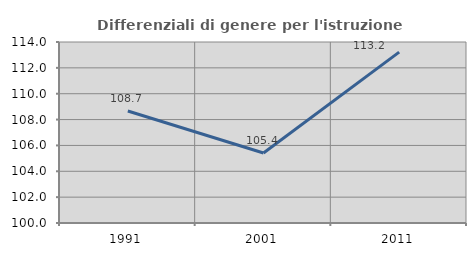
| Category | Differenziali di genere per l'istruzione superiore |
|---|---|
| 1991.0 | 108.66 |
| 2001.0 | 105.416 |
| 2011.0 | 113.22 |